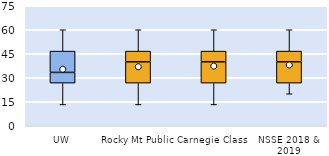
| Category | 25th | 50th | 75th |
|---|---|---|---|
| UW | 26.667 | 6.667 | 13.333 |
| Rocky Mt Public | 26.667 | 13.333 | 6.667 |
| Carnegie Class | 26.667 | 13.333 | 6.667 |
| NSSE 2018 & 2019 | 26.667 | 13.333 | 6.667 |